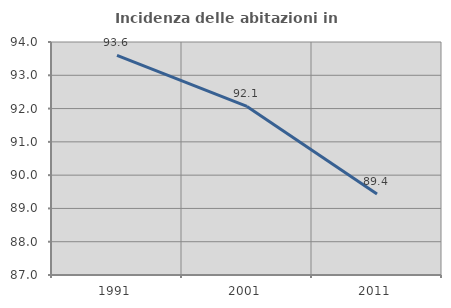
| Category | Incidenza delle abitazioni in proprietà  |
|---|---|
| 1991.0 | 93.6 |
| 2001.0 | 92.063 |
| 2011.0 | 89.431 |